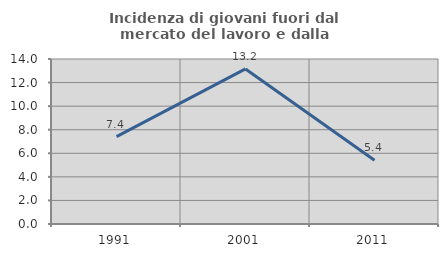
| Category | Incidenza di giovani fuori dal mercato del lavoro e dalla formazione  |
|---|---|
| 1991.0 | 7.407 |
| 2001.0 | 13.158 |
| 2011.0 | 5.405 |